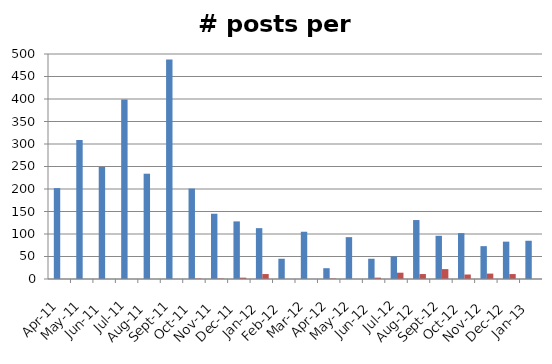
| Category | # posts | top 100 posts |
|---|---|---|
| 2011-04-01 | 202 | 0 |
| 2011-05-01 | 309 | 0 |
| 2011-06-01 | 249 | 0 |
| 2011-07-01 | 399 | 0 |
| 2011-08-01 | 234 | 0 |
| 2011-09-01 | 488 | 0 |
| 2011-10-01 | 201 | 1 |
| 2011-11-01 | 145 | 1 |
| 2011-12-01 | 128 | 3 |
| 2012-01-01 | 113 | 11 |
| 2012-02-01 | 45 | 0 |
| 2012-03-01 | 105 | 0 |
| 2012-04-01 | 24 | 1 |
| 2012-05-01 | 93 | 0 |
| 2012-06-01 | 45 | 3 |
| 2012-07-01 | 50 | 14 |
| 2012-08-01 | 131 | 11 |
| 2012-09-01 | 96 | 22 |
| 2012-10-01 | 102 | 10 |
| 2012-11-01 | 73 | 12 |
| 2012-12-01 | 83 | 11 |
| 2013-01-01 | 85 | 0 |